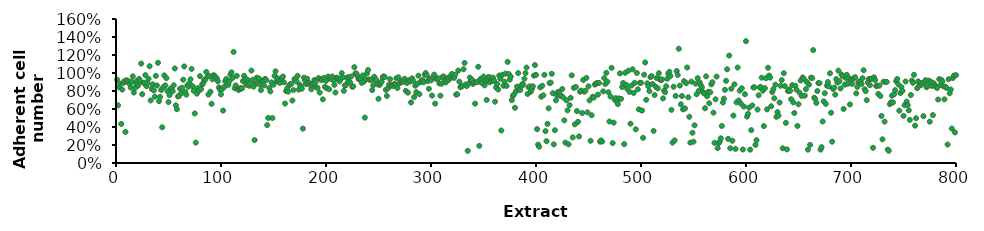
| Category | A2780 |
|---|---|
| 1.0 | 0.926 |
| 2.0 | 0.641 |
| 3.0 | 0.842 |
| 4.0 | 0.882 |
| 5.0 | 0.434 |
| 6.0 | 0.816 |
| 7.0 | 0.89 |
| 8.0 | 0.91 |
| 9.0 | 0.345 |
| 10.0 | 0.92 |
| 11.0 | 0.902 |
| 12.0 | 0.91 |
| 13.0 | 0.878 |
| 14.0 | 0.838 |
| 15.0 | 0.904 |
| 16.0 | 0.963 |
| 17.0 | 0.783 |
| 18.0 | 0.833 |
| 19.0 | 0.89 |
| 20.0 | 0.914 |
| 21.0 | 0.859 |
| 22.0 | 0.933 |
| 23.0 | 0.911 |
| 24.0 | 1.105 |
| 25.0 | 0.765 |
| 26.0 | 0.891 |
| 27.0 | 0.89 |
| 28.0 | 0.976 |
| 29.0 | 0.853 |
| 30.0 | 0.89 |
| 31.0 | 0.936 |
| 32.0 | 1.076 |
| 33.0 | 0.695 |
| 34.0 | 0.823 |
| 35.0 | 0.873 |
| 36.0 | 0.806 |
| 37.0 | 0.736 |
| 38.0 | 0.968 |
| 39.0 | 0.861 |
| 40.0 | 1.113 |
| 41.0 | 0.687 |
| 42.0 | 0.734 |
| 43.0 | 0.811 |
| 44.0 | 0.397 |
| 45.0 | 0.843 |
| 46.0 | 0.973 |
| 47.0 | 0.862 |
| 48.0 | 0.943 |
| 49.0 | 0.798 |
| 50.0 | 0.676 |
| 51.0 | 0.753 |
| 52.0 | 0.827 |
| 53.0 | 0.821 |
| 54.0 | 0.797 |
| 55.0 | 0.864 |
| 56.0 | 1.05 |
| 57.0 | 0.641 |
| 58.0 | 0.598 |
| 59.0 | 0.74 |
| 60.0 | 0.743 |
| 61.0 | 0.825 |
| 62.0 | 0.774 |
| 63.0 | 0.836 |
| 64.0 | 0.925 |
| 65.0 | 1.073 |
| 66.0 | 0.79 |
| 67.0 | 0.759 |
| 68.0 | 0.863 |
| 69.0 | 0.848 |
| 70.0 | 0.888 |
| 71.0 | 0.93 |
| 72.0 | 1.045 |
| 73.0 | 0.853 |
| 74.0 | 0.802 |
| 75.0 | 0.55 |
| 76.0 | 0.227 |
| 77.0 | 0.771 |
| 78.0 | 0.832 |
| 79.0 | 0.802 |
| 80.0 | 0.965 |
| 81.0 | 0.821 |
| 82.0 | 0.874 |
| 83.0 | 0.882 |
| 84.0 | 0.921 |
| 85.0 | 0.927 |
| 86.0 | 1.011 |
| 87.0 | 0.96 |
| 88.0 | 0.76 |
| 89.0 | 0.969 |
| 90.0 | 0.792 |
| 91.0 | 0.657 |
| 92.0 | 0.93 |
| 93.0 | 0.976 |
| 94.0 | 0.968 |
| 95.0 | 0.948 |
| 96.0 | 0.94 |
| 97.0 | 0.909 |
| 98.0 | 0.84 |
| 99.0 | 0.816 |
| 100.0 | 0.763 |
| 101.0 | 0.821 |
| 102.0 | 0.582 |
| 103.0 | 0.844 |
| 104.0 | 0.909 |
| 105.0 | 0.934 |
| 106.0 | 0.878 |
| 107.0 | 0.867 |
| 108.0 | 0.905 |
| 109.0 | 0.983 |
| 110.0 | 1.007 |
| 111.0 | 0.944 |
| 112.0 | 1.234 |
| 113.0 | 0.831 |
| 114.0 | 0.862 |
| 115.0 | 0.969 |
| 116.0 | 0.819 |
| 117.0 | 0.812 |
| 118.0 | 0.829 |
| 119.0 | 0.829 |
| 120.0 | 0.829 |
| 121.0 | 0.911 |
| 122.0 | 0.968 |
| 123.0 | 0.933 |
| 124.0 | 0.87 |
| 125.0 | 0.927 |
| 126.0 | 0.889 |
| 127.0 | 0.858 |
| 128.0 | 0.882 |
| 129.0 | 1.027 |
| 130.0 | 0.924 |
| 131.0 | 0.848 |
| 132.0 | 0.255 |
| 133.0 | 0.883 |
| 134.0 | 0.948 |
| 135.0 | 0.886 |
| 136.0 | 0.94 |
| 137.0 | 0.87 |
| 138.0 | 0.81 |
| 139.0 | 0.913 |
| 140.0 | 0.913 |
| 141.0 | 0.863 |
| 142.0 | 0.934 |
| 143.0 | 0.923 |
| 144.0 | 0.422 |
| 145.0 | 0.501 |
| 146.0 | 0.835 |
| 147.0 | 0.795 |
| 148.0 | 0.896 |
| 149.0 | 0.5 |
| 150.0 | 0.87 |
| 151.0 | 0.969 |
| 152.0 | 1.019 |
| 153.0 | 0.911 |
| 154.0 | 0.94 |
| 155.0 | 0.902 |
| 156.0 | 0.89 |
| 157.0 | 0.928 |
| 158.0 | 0.944 |
| 159.0 | 0.96 |
| 160.0 | 0.896 |
| 161.0 | 0.661 |
| 162.0 | 0.799 |
| 163.0 | 0.828 |
| 164.0 | 0.792 |
| 165.0 | 0.863 |
| 166.0 | 0.875 |
| 167.0 | 0.881 |
| 168.0 | 0.694 |
| 169.0 | 0.81 |
| 170.0 | 0.932 |
| 171.0 | 0.932 |
| 172.0 | 0.905 |
| 173.0 | 0.968 |
| 174.0 | 0.816 |
| 175.0 | 0.87 |
| 176.0 | 0.852 |
| 177.0 | 0.825 |
| 178.0 | 0.381 |
| 179.0 | 0.948 |
| 180.0 | 0.917 |
| 181.0 | 0.877 |
| 182.0 | 0.937 |
| 183.0 | 0.891 |
| 184.0 | 0.889 |
| 185.0 | 0.866 |
| 186.0 | 0.819 |
| 187.0 | 0.866 |
| 188.0 | 0.886 |
| 189.0 | 0.923 |
| 190.0 | 0.898 |
| 191.0 | 0.841 |
| 192.0 | 0.834 |
| 193.0 | 0.944 |
| 194.0 | 0.782 |
| 195.0 | 0.926 |
| 196.0 | 0.923 |
| 197.0 | 0.707 |
| 198.0 | 0.946 |
| 199.0 | 0.845 |
| 200.0 | 0.912 |
| 201.0 | 0.829 |
| 202.0 | 0.96 |
| 203.0 | 0.82 |
| 204.0 | 0.937 |
| 205.0 | 0.937 |
| 206.0 | 0.962 |
| 207.0 | 0.919 |
| 208.0 | 0.868 |
| 209.0 | 0.783 |
| 210.0 | 0.947 |
| 211.0 | 0.947 |
| 212.0 | 0.92 |
| 213.0 | 0.907 |
| 214.0 | 0.94 |
| 215.0 | 0.999 |
| 216.0 | 0.95 |
| 217.0 | 0.801 |
| 218.0 | 0.861 |
| 219.0 | 0.866 |
| 220.0 | 0.949 |
| 221.0 | 0.9 |
| 222.0 | 0.953 |
| 223.0 | 0.896 |
| 224.0 | 0.961 |
| 225.0 | 0.846 |
| 226.0 | 0.851 |
| 227.0 | 1.064 |
| 228.0 | 0.995 |
| 229.0 | 0.994 |
| 230.0 | 0.966 |
| 231.0 | 0.933 |
| 232.0 | 0.933 |
| 233.0 | 0.935 |
| 234.0 | 0.891 |
| 235.0 | 0.973 |
| 236.0 | 0.903 |
| 237.0 | 0.505 |
| 238.0 | 0.93 |
| 239.0 | 0.995 |
| 240.0 | 1.032 |
| 241.0 | 0.927 |
| 242.0 | 0.925 |
| 243.0 | 0.925 |
| 244.0 | 0.81 |
| 245.0 | 0.864 |
| 246.0 | 0.958 |
| 247.0 | 0.925 |
| 248.0 | 0.922 |
| 249.0 | 0.874 |
| 250.0 | 0.714 |
| 251.0 | 0.866 |
| 252.0 | 0.892 |
| 253.0 | 0.903 |
| 254.0 | 0.954 |
| 255.0 | 0.963 |
| 256.0 | 0.954 |
| 257.0 | 0.812 |
| 258.0 | 0.745 |
| 259.0 | 0.831 |
| 260.0 | 0.87 |
| 261.0 | 0.931 |
| 262.0 | 0.858 |
| 263.0 | 0.865 |
| 264.0 | 0.856 |
| 265.0 | 0.879 |
| 266.0 | 0.866 |
| 267.0 | 0.942 |
| 268.0 | 0.833 |
| 269.0 | 0.952 |
| 270.0 | 0.885 |
| 271.0 | 0.912 |
| 272.0 | 0.897 |
| 273.0 | 0.904 |
| 274.0 | 0.909 |
| 275.0 | 0.936 |
| 276.0 | 0.802 |
| 277.0 | 0.889 |
| 278.0 | 0.781 |
| 279.0 | 0.919 |
| 280.0 | 0.904 |
| 281.0 | 0.673 |
| 282.0 | 0.941 |
| 283.0 | 0.916 |
| 284.0 | 0.733 |
| 285.0 | 0.858 |
| 286.0 | 0.787 |
| 287.0 | 0.881 |
| 288.0 | 0.97 |
| 289.0 | 0.764 |
| 290.0 | 0.897 |
| 291.0 | 0.913 |
| 292.0 | 0.921 |
| 293.0 | 0.897 |
| 294.0 | 0.981 |
| 295.0 | 1 |
| 296.0 | 0.973 |
| 297.0 | 0.91 |
| 298.0 | 0.825 |
| 299.0 | 0.932 |
| 300.0 | 0.918 |
| 301.0 | 0.749 |
| 302.0 | 0.955 |
| 303.0 | 0.982 |
| 304.0 | 0.66 |
| 305.0 | 0.933 |
| 306.0 | 0.94 |
| 307.0 | 0.94 |
| 308.0 | 0.883 |
| 309.0 | 0.748 |
| 310.0 | 0.881 |
| 311.0 | 0.956 |
| 312.0 | 0.962 |
| 313.0 | 0.92 |
| 314.0 | 0.895 |
| 315.0 | 0.911 |
| 316.0 | 0.945 |
| 317.0 | 0.925 |
| 318.0 | 0.96 |
| 319.0 | 0.948 |
| 320.0 | 0.989 |
| 321.0 | 0.954 |
| 322.0 | 0.946 |
| 323.0 | 0.98 |
| 324.0 | 0.76 |
| 325.0 | 0.764 |
| 326.0 | 1.027 |
| 327.0 | 0.904 |
| 328.0 | 0.842 |
| 329.0 | 0.851 |
| 330.0 | 0.856 |
| 331.0 | 1.042 |
| 332.0 | 1.112 |
| 333.0 | 0.872 |
| 334.0 | 0.854 |
| 335.0 | 0.135 |
| 336.0 | 0.883 |
| 337.0 | 0.949 |
| 338.0 | 0.911 |
| 339.0 | 0.925 |
| 340.0 | 0.88 |
| 341.0 | 0.894 |
| 342.0 | 0.659 |
| 343.0 | 0.898 |
| 344.0 | 0.899 |
| 345.0 | 1.069 |
| 346.0 | 0.19 |
| 347.0 | 0.932 |
| 348.0 | 0.893 |
| 349.0 | 0.933 |
| 350.0 | 0.96 |
| 351.0 | 0.862 |
| 352.0 | 0.917 |
| 353.0 | 0.701 |
| 354.0 | 0.908 |
| 355.0 | 0.957 |
| 356.0 | 0.897 |
| 357.0 | 0.924 |
| 358.0 | 0.912 |
| 359.0 | 0.949 |
| 360.0 | 0.915 |
| 361.0 | 0.681 |
| 362.0 | 0.839 |
| 363.0 | 0.879 |
| 364.0 | 0.816 |
| 365.0 | 0.972 |
| 366.0 | 0.938 |
| 367.0 | 0.361 |
| 368.0 | 0.981 |
| 369.0 | 0.859 |
| 370.0 | 0.904 |
| 371.0 | 0.993 |
| 372.0 | 0.856 |
| 373.0 | 1.124 |
| 374.0 | 0.989 |
| 375.0 | 0.927 |
| 376.0 | 0.959 |
| 377.0 | 0.699 |
| 378.0 | 0.746 |
| 379.0 | 0.762 |
| 380.0 | 0.614 |
| 381.0 | 0.799 |
| 382.0 | 0.85 |
| 383.0 | 0.999 |
| 384.0 | 0.813 |
| 385.0 | 0.811 |
| 386.0 | 0.857 |
| 387.0 | 0.877 |
| 388.0 | 0.87 |
| 389.0 | 0.936 |
| 390.0 | 0.998 |
| 391.0 | 1.06 |
| 392.0 | 0.767 |
| 393.0 | 0.841 |
| 394.0 | 0.851 |
| 395.0 | 0.792 |
| 396.0 | 0.822 |
| 397.0 | 0.853 |
| 398.0 | 0.971 |
| 399.0 | 1.088 |
| 400.0 | 0.979 |
| 401.0 | 0.377 |
| 402.0 | 0.204 |
| 403.0 | 0.181 |
| 404.0 | 0.84 |
| 405.0 | 0.737 |
| 406.0 | 0.859 |
| 407.0 | 0.752 |
| 408.0 | 0.979 |
| 409.0 | 0.354 |
| 410.0 | 0.242 |
| 411.0 | 0.435 |
| 412.0 | 0.607 |
| 413.0 | 0.888 |
| 414.0 | 0.894 |
| 415.0 | 0.991 |
| 416.0 | 0.776 |
| 417.0 | 0.207 |
| 418.0 | 0.364 |
| 419.0 | 0.696 |
| 420.0 | 0.752 |
| 421.0 | 0.789 |
| 422.0 | 0.782 |
| 423.0 | 0.747 |
| 424.0 | 0.748 |
| 425.0 | 0.822 |
| 426.0 | 0.728 |
| 427.0 | 0.474 |
| 428.0 | 0.227 |
| 429.0 | 0.696 |
| 430.0 | 0.585 |
| 431.0 | 0.207 |
| 432.0 | 0.642 |
| 433.0 | 0.724 |
| 434.0 | 0.974 |
| 435.0 | 0.284 |
| 436.0 | 0.835 |
| 437.0 | 0.429 |
| 438.0 | 0.845 |
| 439.0 | 0.577 |
| 440.0 | 0.457 |
| 441.0 | 0.294 |
| 442.0 | 0.792 |
| 443.0 | 0.804 |
| 444.0 | 0.555 |
| 445.0 | 0.922 |
| 446.0 | 0.793 |
| 447.0 | 0.802 |
| 448.0 | 0.946 |
| 449.0 | 0.563 |
| 450.0 | 0.852 |
| 451.0 | 0.696 |
| 452.0 | 0.247 |
| 453.0 | 0.53 |
| 454.0 | 0.736 |
| 455.0 | 0.727 |
| 456.0 | 0.871 |
| 457.0 | 0.881 |
| 458.0 | 0.887 |
| 459.0 | 0.76 |
| 460.0 | 0.889 |
| 461.0 | 0.237 |
| 462.0 | 0.251 |
| 463.0 | 0.238 |
| 464.0 | 0.796 |
| 465.0 | 0.943 |
| 466.0 | 0.878 |
| 467.0 | 1.002 |
| 468.0 | 0.902 |
| 469.0 | 0.786 |
| 470.0 | 0.461 |
| 471.0 | 0.738 |
| 472.0 | 1.057 |
| 473.0 | 0.221 |
| 474.0 | 0.448 |
| 475.0 | 0.703 |
| 476.0 | 0.72 |
| 477.0 | 0.679 |
| 478.0 | 0.655 |
| 479.0 | 0.717 |
| 480.0 | 0.995 |
| 481.0 | 0.712 |
| 482.0 | 0.844 |
| 483.0 | 0.889 |
| 484.0 | 0.21 |
| 485.0 | 1.003 |
| 486.0 | 0.869 |
| 487.0 | 0.822 |
| 488.0 | 1.026 |
| 489.0 | 0.792 |
| 490.0 | 0.436 |
| 491.0 | 0.861 |
| 492.0 | 1.041 |
| 493.0 | 0.778 |
| 494.0 | 0.891 |
| 495.0 | 0.374 |
| 496.0 | 1.001 |
| 497.0 | 0.819 |
| 498.0 | 0.596 |
| 499.0 | 0.89 |
| 500.0 | 0.89 |
| 501.0 | 0.583 |
| 502.0 | 0.28 |
| 503.0 | 0.981 |
| 504.0 | 1.117 |
| 505.0 | 0.703 |
| 506.0 | 0.885 |
| 507.0 | 0.852 |
| 508.0 | 0.799 |
| 509.0 | 0.954 |
| 510.0 | 0.966 |
| 511.0 | 0.878 |
| 512.0 | 0.357 |
| 513.0 | 0.756 |
| 514.0 | 0.847 |
| 515.0 | 0.943 |
| 516.0 | 0.829 |
| 517.0 | 0.998 |
| 518.0 | 0.93 |
| 519.0 | 0.922 |
| 520.0 | 0.929 |
| 521.0 | 0.718 |
| 522.0 | 0.804 |
| 523.0 | 0.787 |
| 524.0 | 0.853 |
| 525.0 | 0.936 |
| 526.0 | 0.992 |
| 527.0 | 1.013 |
| 528.0 | 0.966 |
| 529.0 | 0.59 |
| 530.0 | 0.227 |
| 531.0 | 0.847 |
| 532.0 | 0.251 |
| 533.0 | 0.745 |
| 534.0 | 1.022 |
| 535.0 | 0.979 |
| 536.0 | 1.27 |
| 537.0 | 0.86 |
| 538.0 | 0.652 |
| 539.0 | 0.744 |
| 540.0 | 0.596 |
| 541.0 | 0.909 |
| 542.0 | 0.606 |
| 543.0 | 0.888 |
| 544.0 | 1.061 |
| 545.0 | 0.73 |
| 546.0 | 0.513 |
| 547.0 | 0.227 |
| 548.0 | 0.905 |
| 549.0 | 0.336 |
| 550.0 | 0.237 |
| 551.0 | 0.418 |
| 552.0 | 0.881 |
| 553.0 | 0.764 |
| 554.0 | 0.943 |
| 555.0 | 0.801 |
| 556.0 | 0.894 |
| 557.0 | 0.862 |
| 558.0 | 0.841 |
| 559.0 | 0.789 |
| 560.0 | 0.774 |
| 561.0 | 0.608 |
| 562.0 | 0.963 |
| 563.0 | 0.742 |
| 564.0 | 0.791 |
| 565.0 | 0.663 |
| 566.0 | 0.787 |
| 567.0 | 0.873 |
| 568.0 | 0.898 |
| 569.0 | 0.559 |
| 570.0 | 0.224 |
| 571.0 | 0.708 |
| 572.0 | 0.96 |
| 573.0 | 0.165 |
| 574.0 | 0.219 |
| 575.0 | 0.239 |
| 576.0 | 0.274 |
| 577.0 | 0.412 |
| 578.0 | 0.672 |
| 579.0 | 0.715 |
| 580.0 | 0.813 |
| 581.0 | 0.912 |
| 582.0 | 1.042 |
| 583.0 | 0.268 |
| 584.0 | 1.194 |
| 585.0 | 0.164 |
| 586.0 | 0.825 |
| 587.0 | 0.247 |
| 588.0 | 0.527 |
| 589.0 | 0.874 |
| 590.0 | 0.157 |
| 591.0 | 0.674 |
| 592.0 | 1.061 |
| 593.0 | 0.695 |
| 594.0 | 0.804 |
| 595.0 | 0.661 |
| 596.0 | 0.83 |
| 597.0 | 0.15 |
| 598.0 | 0.627 |
| 599.0 | 0.764 |
| 600.0 | 1.354 |
| 601.0 | 0.515 |
| 602.0 | 0.546 |
| 603.0 | 0.614 |
| 604.0 | 0.148 |
| 605.0 | 0.365 |
| 606.0 | 0.64 |
| 607.0 | 0.839 |
| 608.0 | 0.841 |
| 609.0 | 0.201 |
| 610.0 | 0.253 |
| 611.0 | 0.594 |
| 612.0 | 0.753 |
| 613.0 | 0.839 |
| 614.0 | 0.846 |
| 615.0 | 0.948 |
| 616.0 | 0.804 |
| 617.0 | 0.41 |
| 618.0 | 0.831 |
| 619.0 | 0.942 |
| 620.0 | 0.596 |
| 621.0 | 1.058 |
| 622.0 | 0.971 |
| 623.0 | 0.949 |
| 624.0 | 0.63 |
| 625.0 | 0.787 |
| 626.0 | 0.82 |
| 627.0 | 0.719 |
| 628.0 | 0.87 |
| 629.0 | 0.513 |
| 630.0 | 0.566 |
| 631.0 | 0.527 |
| 632.0 | 0.672 |
| 633.0 | 0.858 |
| 634.0 | 0.921 |
| 635.0 | 0.164 |
| 636.0 | 0.997 |
| 637.0 | 0.855 |
| 638.0 | 0.446 |
| 639.0 | 0.151 |
| 640.0 | 0.8 |
| 641.0 | 0.815 |
| 642.0 | 0.801 |
| 643.0 | 0.708 |
| 644.0 | 0.865 |
| 645.0 | 0.674 |
| 646.0 | 0.556 |
| 647.0 | 0.858 |
| 648.0 | 0.815 |
| 649.0 | 0.412 |
| 650.0 | 0.652 |
| 651.0 | 0.782 |
| 652.0 | 0.916 |
| 653.0 | 0.745 |
| 654.0 | 0.95 |
| 655.0 | 0.935 |
| 656.0 | 0.748 |
| 657.0 | 0.821 |
| 658.0 | 0.899 |
| 659.0 | 0.148 |
| 660.0 | 0.87 |
| 661.0 | 0.201 |
| 662.0 | 0.948 |
| 663.0 | 0.944 |
| 664.0 | 1.255 |
| 665.0 | 0.725 |
| 666.0 | 0.711 |
| 667.0 | 0.667 |
| 668.0 | 0.799 |
| 669.0 | 0.888 |
| 670.0 | 0.887 |
| 671.0 | 0.149 |
| 672.0 | 0.176 |
| 673.0 | 0.461 |
| 674.0 | 0.685 |
| 675.0 | 0.775 |
| 676.0 | 0.657 |
| 677.0 | 0.86 |
| 678.0 | 0.899 |
| 679.0 | 0.852 |
| 680.0 | 0.997 |
| 681.0 | 0.558 |
| 682.0 | 0.237 |
| 683.0 | 0.823 |
| 684.0 | 0.837 |
| 685.0 | 0.759 |
| 686.0 | 0.932 |
| 687.0 | 0.894 |
| 688.0 | 1.026 |
| 689.0 | 0.909 |
| 690.0 | 0.829 |
| 691.0 | 0.983 |
| 692.0 | 0.965 |
| 693.0 | 0.601 |
| 694.0 | 0.871 |
| 695.0 | 0.945 |
| 696.0 | 0.979 |
| 697.0 | 0.881 |
| 698.0 | 0.94 |
| 699.0 | 0.65 |
| 700.0 | 0.926 |
| 701.0 | 0.879 |
| 702.0 | 0.936 |
| 703.0 | 0.946 |
| 704.0 | 0.954 |
| 705.0 | 0.774 |
| 706.0 | 0.846 |
| 707.0 | 0.894 |
| 708.0 | 0.907 |
| 709.0 | 0.901 |
| 710.0 | 0.878 |
| 711.0 | 0.942 |
| 712.0 | 1.031 |
| 713.0 | 0.819 |
| 714.0 | 0.798 |
| 715.0 | 0.698 |
| 716.0 | 0.893 |
| 717.0 | 0.933 |
| 718.0 | 0.865 |
| 719.0 | 0.934 |
| 720.0 | 0.94 |
| 721.0 | 0.169 |
| 722.0 | 0.952 |
| 723.0 | 0.922 |
| 724.0 | 0.855 |
| 725.0 | 0.859 |
| 726.0 | 0.767 |
| 727.0 | 0.86 |
| 728.0 | 0.744 |
| 729.0 | 0.523 |
| 730.0 | 0.263 |
| 731.0 | 0.903 |
| 732.0 | 0.46 |
| 733.0 | 0.9 |
| 734.0 | 0.901 |
| 735.0 | 0.148 |
| 736.0 | 0.136 |
| 737.0 | 0.654 |
| 738.0 | 0.673 |
| 739.0 | 0.748 |
| 740.0 | 0.673 |
| 741.0 | 0.764 |
| 742.0 | 0.81 |
| 743.0 | 0.909 |
| 744.0 | 0.933 |
| 745.0 | 0.874 |
| 746.0 | 0.581 |
| 747.0 | 0.777 |
| 748.0 | 0.842 |
| 749.0 | 0.801 |
| 750.0 | 0.524 |
| 751.0 | 0.642 |
| 752.0 | 0.906 |
| 753.0 | 0.682 |
| 754.0 | 0.644 |
| 755.0 | 0.585 |
| 756.0 | 0.479 |
| 757.0 | 0.755 |
| 758.0 | 0.915 |
| 759.0 | 0.891 |
| 760.0 | 0.98 |
| 761.0 | 0.415 |
| 762.0 | 0.498 |
| 763.0 | 0.831 |
| 764.0 | 0.907 |
| 765.0 | 0.859 |
| 766.0 | 0.888 |
| 767.0 | 0.869 |
| 768.0 | 0.886 |
| 769.0 | 0.521 |
| 770.0 | 0.903 |
| 771.0 | 0.921 |
| 772.0 | 0.842 |
| 773.0 | 0.855 |
| 774.0 | 0.916 |
| 775.0 | 0.459 |
| 776.0 | 0.903 |
| 777.0 | 0.857 |
| 778.0 | 0.532 |
| 779.0 | 0.886 |
| 780.0 | 0.857 |
| 781.0 | 0.844 |
| 782.0 | 0.834 |
| 783.0 | 0.705 |
| 784.0 | 0.932 |
| 785.0 | 0.865 |
| 786.0 | 0.924 |
| 787.0 | 0.908 |
| 788.0 | 0.852 |
| 789.0 | 0.707 |
| 790.0 | 0.846 |
| 791.0 | 0.834 |
| 792.0 | 0.205 |
| 793.0 | 0.931 |
| 794.0 | 0.775 |
| 795.0 | 0.816 |
| 796.0 | 0.383 |
| 797.0 | 0.944 |
| 798.0 | 0.971 |
| 799.0 | 0.34 |
| 800.0 | 0.976 |